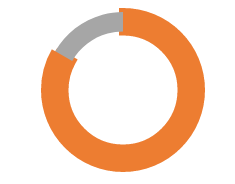
| Category | Series 0 |
|---|---|
| 0 | -0.833 |
| 1 | 0.167 |